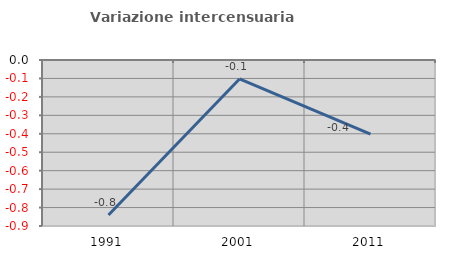
| Category | Variazione intercensuaria annua |
|---|---|
| 1991.0 | -0.84 |
| 2001.0 | -0.103 |
| 2011.0 | -0.402 |